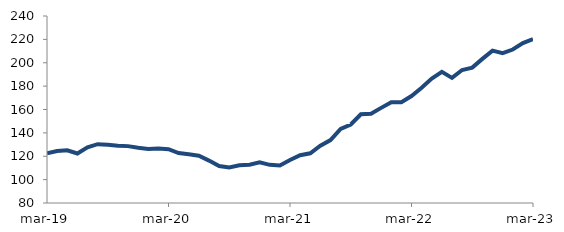
| Category | Series 0 |
|---|---|
| 2019-03-01 | 122.605 |
| 2019-04-01 | 124.541 |
| 2019-05-01 | 125.115 |
| 2019-06-01 | 122.365 |
| 2019-07-01 | 127.653 |
| 2019-08-01 | 130.323 |
| 2019-09-01 | 129.814 |
| 2019-10-01 | 129.013 |
| 2019-11-01 | 128.663 |
| 2019-12-01 | 127.192 |
| 2020-01-01 | 126.144 |
| 2020-02-01 | 126.638 |
| 2020-03-01 | 125.992 |
| 2020-04-01 | 122.726 |
| 2020-05-01 | 121.669 |
| 2020-06-01 | 120.485 |
| 2020-07-01 | 116.268 |
| 2020-08-01 | 111.597 |
| 2020-09-01 | 110.39 |
| 2020-10-01 | 112.229 |
| 2020-11-01 | 112.769 |
| 2020-12-01 | 114.741 |
| 2021-01-01 | 112.625 |
| 2021-02-01 | 112.14 |
| 2021-03-01 | 116.74 |
| 2021-04-01 | 120.911 |
| 2021-05-01 | 122.536 |
| 2021-06-01 | 128.968 |
| 2021-07-01 | 133.864 |
| 2021-08-01 | 143.384 |
| 2021-09-01 | 147.196 |
| 2021-10-01 | 155.883 |
| 2021-11-01 | 156.426 |
| 2021-12-01 | 161.4 |
| 2022-01-01 | 166.276 |
| 2022-02-01 | 166.219 |
| 2022-03-01 | 171.531 |
| 2022-04-01 | 178.644 |
| 2022-05-01 | 186.465 |
| 2022-06-01 | 192.187 |
| 2022-07-01 | 187.044 |
| 2022-08-01 | 193.806 |
| 2022-09-01 | 195.846 |
| 2022-10-01 | 203.287 |
| 2022-11-01 | 210.344 |
| 2022-12-01 | 208.16 |
| 2023-01-01 | 211.29 |
| 2023-02-01 | 216.772 |
| 2023-03-01 | 220.156 |